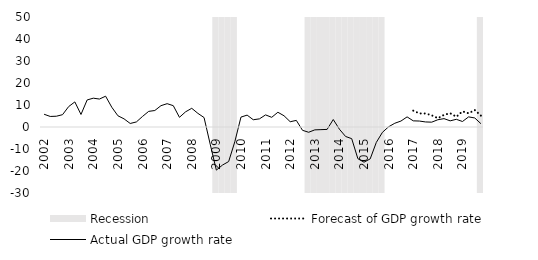
| Category | Recession |
|---|---|
| 2002.0 | 0 |
| 2002.0 | 0 |
| 2002.0 | 0 |
| 2002.0 | 0 |
| 2003.0 | 0 |
| 2003.0 | 0 |
| 2003.0 | 0 |
| 2003.0 | 0 |
| 2004.0 | 0 |
| 2004.0 | 0 |
| 2004.0 | 0 |
| 2004.0 | 0 |
| 2005.0 | 0 |
| 2005.0 | 0 |
| 2005.0 | 0 |
| 2005.0 | 0 |
| 2006.0 | 0 |
| 2006.0 | 0 |
| 2006.0 | 0 |
| 2006.0 | 0 |
| 2007.0 | 0 |
| 2007.0 | 0 |
| 2007.0 | 0 |
| 2007.0 | 0 |
| 2008.0 | 0 |
| 2008.0 | 0 |
| 2008.0 | 0 |
| 2008.0 | 0 |
| 2009.0 | 1 |
| 2009.0 | 1 |
| 2009.0 | 1 |
| 2009.0 | 1 |
| 2010.0 | 0 |
| 2010.0 | 0 |
| 2010.0 | 0 |
| 2010.0 | 0 |
| 2011.0 | 0 |
| 2011.0 | 0 |
| 2011.0 | 0 |
| 2011.0 | 0 |
| 2012.0 | 0 |
| 2012.0 | 0 |
| 2012.0 | 0 |
| 2012.0 | 1 |
| 2013.0 | 1 |
| 2013.0 | 1 |
| 2013.0 | 1 |
| 2013.0 | 1 |
| 2014.0 | 1 |
| 2014.0 | 1 |
| 2014.0 | 1 |
| 2014.0 | 1 |
| 2015.0 | 1 |
| 2015.0 | 1 |
| 2015.0 | 1 |
| 2015.0 | 1 |
| 2016.0 | 0 |
| 2016.0 | 0 |
| 2016.0 | 0 |
| 2016.0 | 0 |
| 2017.0 | 0 |
| 2017.0 | 0 |
| 2017.0 | 0 |
| 2017.0 | 0 |
| 2018.0 | 0 |
| 2018.0 | 0 |
| 2018.0 | 0 |
| 2018.0 | 0 |
| 2019.0 | 0 |
| 2019.0 | 0 |
| 2019.0 | 0 |
| 2019.0 | 1 |